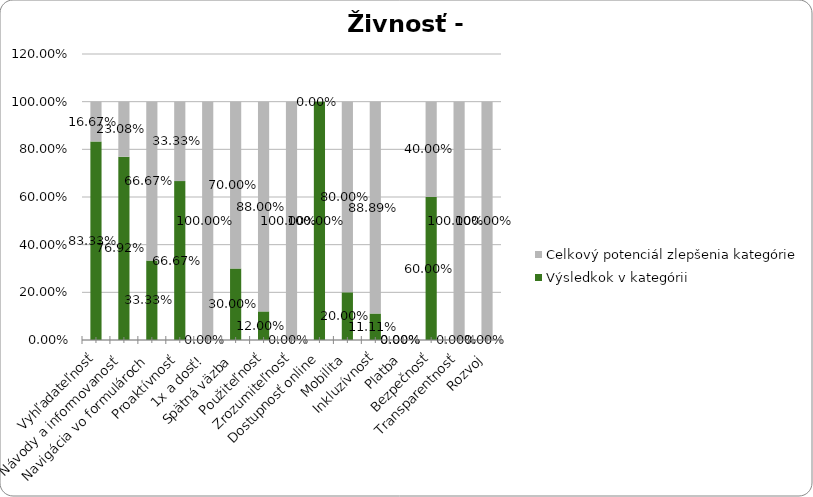
| Category | Výsledkok v kategórii | Celkový potenciál zlepšenia kategórie |
|---|---|---|
| Vyhľadateľnosť | 0.833 | 0.167 |
| Návody a informovanosť | 0.769 | 0.231 |
| Navigácia vo formulároch | 0.333 | 0.667 |
| Proaktívnosť | 0.667 | 0.333 |
| 1x a dosť! | 0 | 1 |
| Spätná väzba | 0.3 | 0.7 |
| Použiteľnosť | 0.12 | 0.88 |
| Zrozumiteľnosť | 0 | 1 |
| Dostupnosť online | 1 | 0 |
| Mobilita | 0.2 | 0.8 |
| Inkluzívnosť | 0.111 | 0.889 |
| Platba | 0 | 0 |
| Bezpečnosť | 0.6 | 0.4 |
| Transparentnosť | 0 | 1 |
| Rozvoj | 0 | 1 |